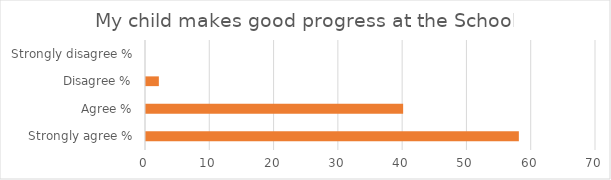
| Category | Series 1 |
|---|---|
| Strongly agree % | 58 |
| Agree % | 40 |
| Disagree % | 2 |
| Strongly disagree % | 0 |